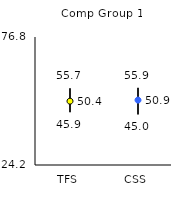
| Category | 25th | 75th | Mean |
|---|---|---|---|
| TFS | 45.9 | 55.7 | 50.43 |
| CSS | 45 | 55.9 | 50.87 |